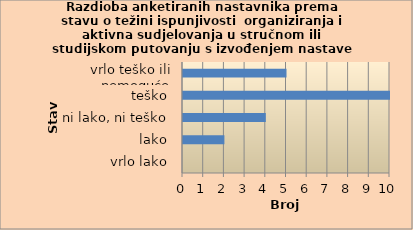
| Category | Series 0 |
|---|---|
| vrlo lako | 0 |
| lako | 2 |
| ni lako, ni teško | 4 |
| teško | 10 |
| vrlo teško ili nemoguće | 5 |